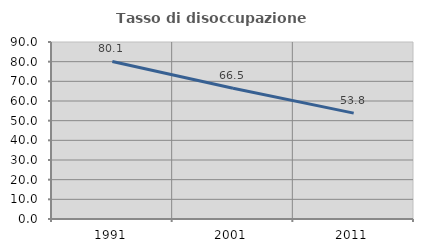
| Category | Tasso di disoccupazione giovanile  |
|---|---|
| 1991.0 | 80.1 |
| 2001.0 | 66.521 |
| 2011.0 | 53.835 |